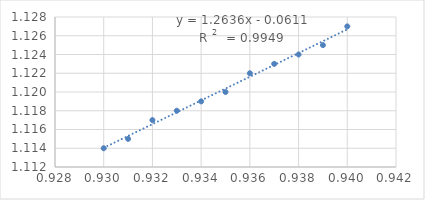
| Category | Series 0 |
|---|---|
| 0.93 | 1.114 |
| 0.931 | 1.115 |
| 0.932 | 1.117 |
| 0.933 | 1.118 |
| 0.934 | 1.119 |
| 0.935 | 1.12 |
| 0.936 | 1.122 |
| 0.937 | 1.123 |
| 0.938 | 1.124 |
| 0.939 | 1.125 |
| 0.94 | 1.127 |